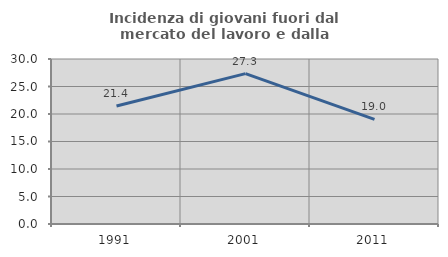
| Category | Incidenza di giovani fuori dal mercato del lavoro e dalla formazione  |
|---|---|
| 1991.0 | 21.44 |
| 2001.0 | 27.336 |
| 2011.0 | 19.034 |